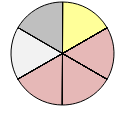
| Category | Series 1 |
|---|---|
| + + | 0 |
| + | 0 |
| o | 1 |
| - | 0 |
| - - | 0 |
| + + | 0 |
| + | 0 |
| o | 0 |
| - | 1 |
| - - | 0 |
| + + | 0 |
| + | 0 |
| o | 0 |
| - | 1 |
| - - | 0 |
| + + | 0 |
| + | 0 |
| o | 0 |
| - | 1 |
| - - | 0 |
| * * | 0 |
| * | 0 |
| o | 1 |
| * * | 0 |
| * | 1 |
| o | 0 |